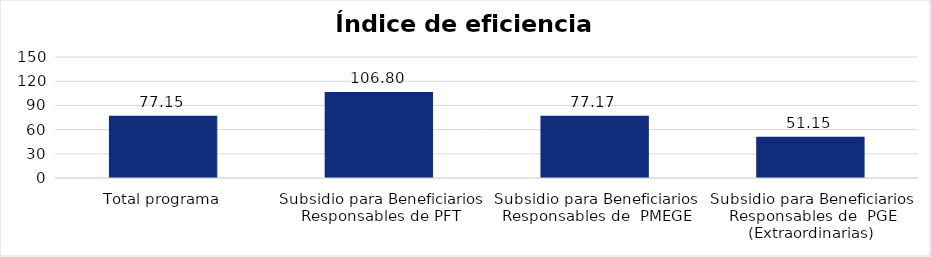
| Category | Índice de eficiencia (IE)  |
|---|---|
| Total programa | 77.153 |
| Subsidio para Beneficiarios Responsables de PFT | 106.796 |
| Subsidio para Beneficiarios Responsables de  PMEGE | 77.174 |
| Subsidio para Beneficiarios Responsables de  PGE (Extraordinarias) | 51.151 |